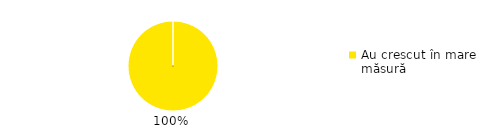
| Category | Total |
|---|---|
| Au crescut în mare măsură | 1 |